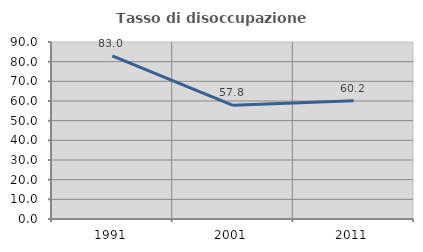
| Category | Tasso di disoccupazione giovanile  |
|---|---|
| 1991.0 | 82.967 |
| 2001.0 | 57.831 |
| 2011.0 | 60.163 |